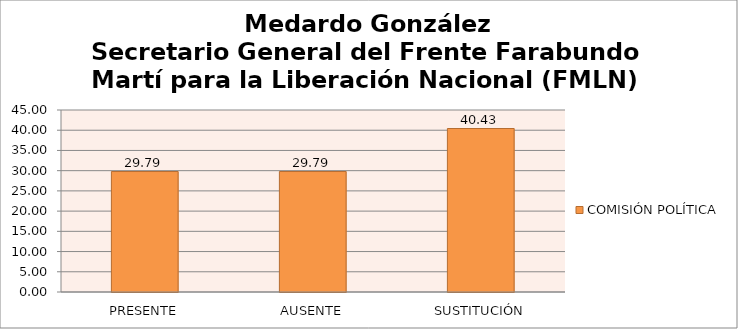
| Category | COMISIÓN POLÍTICA |
|---|---|
| PRESENTE | 29.787 |
| AUSENTE | 29.787 |
| SUSTITUCIÓN | 40.426 |